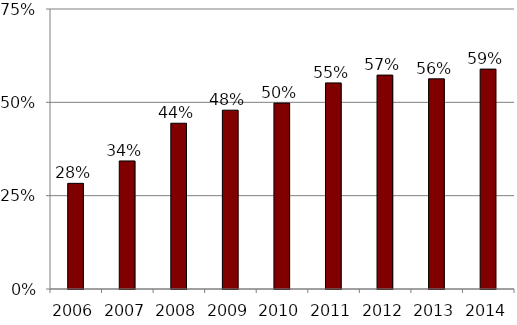
| Category | Series 0 |
|---|---|
| 2006.0 | 0.283 |
| 2007.0 | 0.343 |
| 2008.0 | 0.444 |
| 2009.0 | 0.479 |
| 2010.0 | 0.498 |
| 2011.0 | 0.552 |
| 2012.0 | 0.573 |
| 2013.0 | 0.563 |
| 2014.0 | 0.589 |